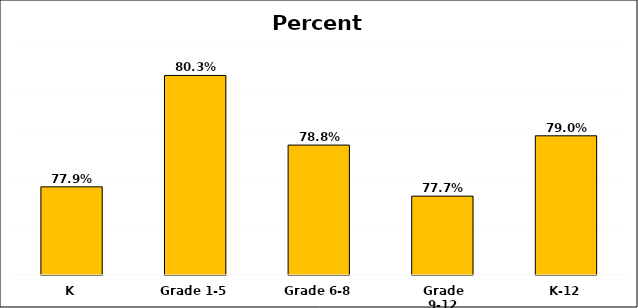
| Category | District* |
|---|---|
| K | 0.779 |
| Grade 1-5 | 0.803 |
| Grade 6-8 | 0.788 |
| Grade 9-12 | 0.777 |
| K-12 | 0.79 |